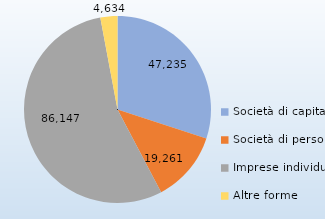
| Category | Series 0 |
|---|---|
| Società di capitale | 47235 |
| Società di persone | 19261 |
| Imprese individuali | 86147 |
| Altre forme | 4634 |